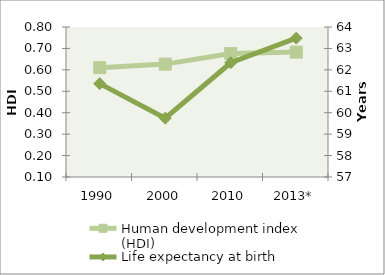
| Category | Human development index (HDI) |
|---|---|
| 1990 | 0.61 |
| 2000 | 0.627 |
| 2010 | 0.676 |
| 2013* | 0.683 |